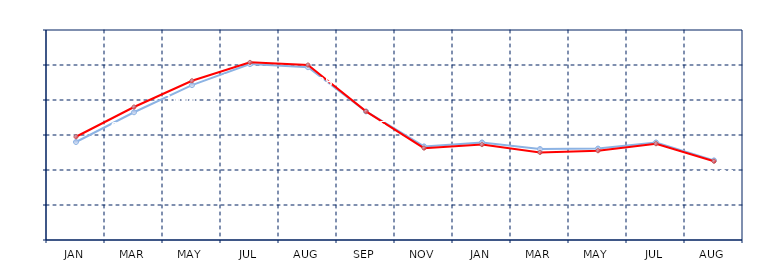
| Category | Series 0 | Series 1 |
|---|---|---|
| JAN | 988 | 989.5 |
| MAR | 996.5 | 998 |
| MAY | 1004.25 | 1005.5 |
| JUL | 1010.25 | 1010.75 |
| AUG | 1009.375 | 1010 |
| SEP | 996.75 | 996.75 |
| NOV | 986.75 | 986.25 |
| JAN | 987.875 | 987.25 |
| MAR | 986 | 985 |
| MAY | 986.125 | 985.5 |
| JUL | 987.875 | 987.5 |
| AUG | 982.75 | 982.5 |